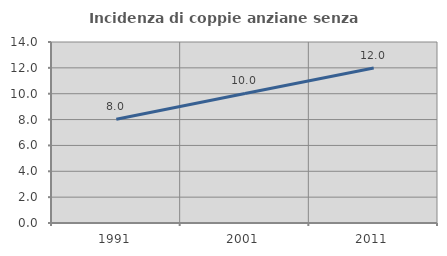
| Category | Incidenza di coppie anziane senza figli  |
|---|---|
| 1991.0 | 8.022 |
| 2001.0 | 10.019 |
| 2011.0 | 11.988 |